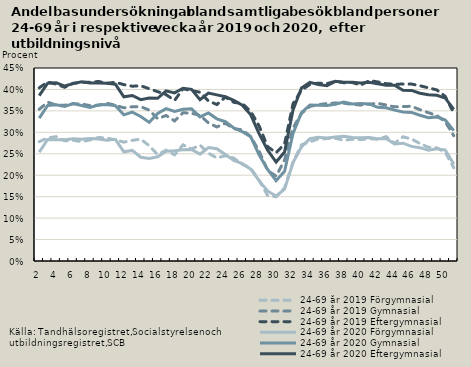
| Category | 24-69 år |
|---|---|
| 2.0 | 0.386 |
| 3.0 | 0.415 |
| 4.0 | 0.416 |
| 5.0 | 0.408 |
| 6.0 | 0.414 |
| 7.0 | 0.418 |
| 8.0 | 0.415 |
| 9.0 | 0.415 |
| 10.0 | 0.415 |
| 11.0 | 0.412 |
| 12.0 | 0.383 |
| 13.0 | 0.386 |
| 14.0 | 0.376 |
| 15.0 | 0.38 |
| 16.0 | 0.379 |
| 17.0 | 0.397 |
| 18.0 | 0.392 |
| 19.0 | 0.403 |
| 20.0 | 0.4 |
| 21.0 | 0.376 |
| 22.0 | 0.392 |
| 23.0 | 0.387 |
| 24.0 | 0.383 |
| 25.0 | 0.375 |
| 26.0 | 0.363 |
| 27.0 | 0.341 |
| 28.0 | 0.296 |
| 29.0 | 0.258 |
| 30.0 | 0.231 |
| 31.0 | 0.254 |
| 32.0 | 0.352 |
| 33.0 | 0.404 |
| 34.0 | 0.417 |
| 35.0 | 0.411 |
| 36.0 | 0.409 |
| 37.0 | 0.419 |
| 38.0 | 0.417 |
| 39.0 | 0.417 |
| 40.0 | 0.415 |
| 41.0 | 0.417 |
| 42.0 | 0.413 |
| 43.0 | 0.41 |
| 44.0 | 0.41 |
| 45.0 | 0.398 |
| 46.0 | 0.398 |
| 47.0 | 0.391 |
| 48.0 | 0.387 |
| 49.0 | 0.386 |
| 50.0 | 0.38 |
| 51.0 | 0.353 |